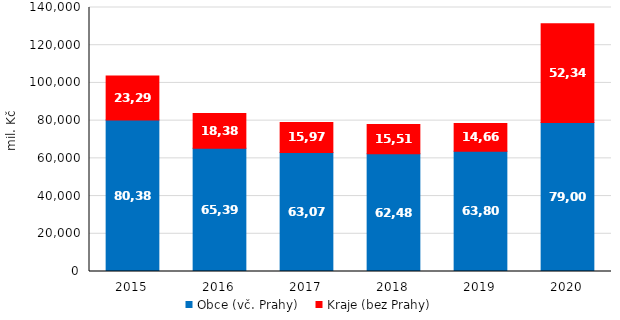
| Category | Obce (vč. Prahy) | Kraje (bez Prahy) |
|---|---|---|
| 2015.0 | 80385.827 | 23293.153 |
| 2016.0 | 65398.065 | 18384.515 |
| 2017.0 | 63076.61 | 15978.105 |
| 2018.0 | 62483.21 | 15511.372 |
| 2019.0 | 63807.312 | 14661.077 |
| 2020.0 | 79000.901 | 52347.076 |